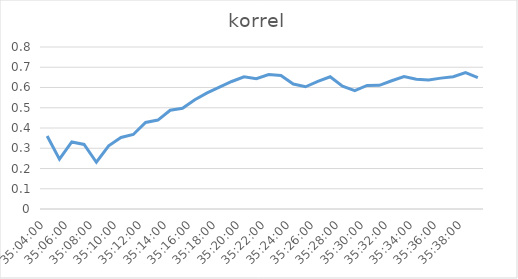
| Category | korrel |
|---|---|
| 1900-01-01 11:04:00 | 0.361 |
| 1900-01-01 11:05:00 | 0.246 |
| 1900-01-01 11:06:00 | 0.331 |
| 1900-01-01 11:07:00 | 0.319 |
| 1900-01-01 11:08:00 | 0.231 |
| 1900-01-01 11:09:00 | 0.312 |
| 1900-01-01 11:10:00 | 0.353 |
| 1900-01-01 11:11:00 | 0.368 |
| 1900-01-01 11:12:00 | 0.427 |
| 1900-01-01 11:13:00 | 0.439 |
| 1900-01-01 11:14:00 | 0.488 |
| 1900-01-01 11:15:00 | 0.498 |
| 1900-01-01 11:16:00 | 0.539 |
| 1900-01-01 11:17:00 | 0.573 |
| 1900-01-01 11:18:00 | 0.602 |
| 1900-01-01 11:19:00 | 0.63 |
| 1900-01-01 11:20:00 | 0.653 |
| 1900-01-01 11:21:00 | 0.643 |
| 1900-01-01 11:22:00 | 0.664 |
| 1900-01-01 11:23:00 | 0.659 |
| 1900-01-01 11:24:00 | 0.617 |
| 1900-01-01 11:25:00 | 0.604 |
| 1900-01-01 11:26:00 | 0.63 |
| 1900-01-01 11:27:00 | 0.653 |
| 1900-01-01 11:28:00 | 0.606 |
| 1900-01-01 11:29:00 | 0.584 |
| 1900-01-01 11:30:00 | 0.61 |
| 1900-01-01 11:31:00 | 0.611 |
| 1900-01-01 11:32:00 | 0.633 |
| 1900-01-01 11:33:00 | 0.654 |
| 1900-01-01 11:34:00 | 0.64 |
| 1900-01-01 11:35:00 | 0.637 |
| 1900-01-01 11:36:00 | 0.646 |
| 1900-01-01 11:37:00 | 0.654 |
| 1900-01-01 11:38:00 | 0.673 |
| 1900-01-01 11:39:00 | 0.648 |